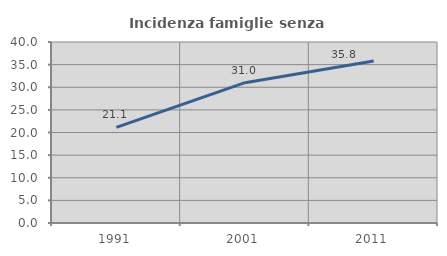
| Category | Incidenza famiglie senza nuclei |
|---|---|
| 1991.0 | 21.116 |
| 2001.0 | 31.01 |
| 2011.0 | 35.784 |